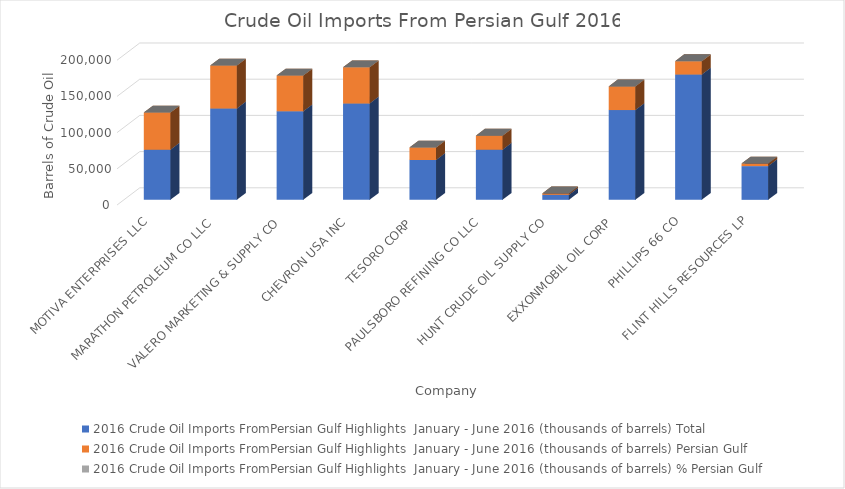
| Category | 2016 Crude Oil Imports FromPersian Gulf Highlights  |
|---|---|
| MOTIVA ENTERPRISES LLC | 0.74 |
| MARATHON PETROLEUM CO LLC | 0.468 |
| VALERO MARKETING & SUPPLY CO | 0.405 |
| CHEVRON USA INC | 0.375 |
| TESORO CORP | 0.312 |
| PAULSBORO REFINING CO LLC | 0.28 |
| HUNT CRUDE OIL SUPPLY CO | 0.284 |
| EXXONMOBIL OIL CORP | 0.263 |
| PHILLIPS 66 CO | 0.106 |
| FLINT HILLS RESOURCES LP | 0.076 |